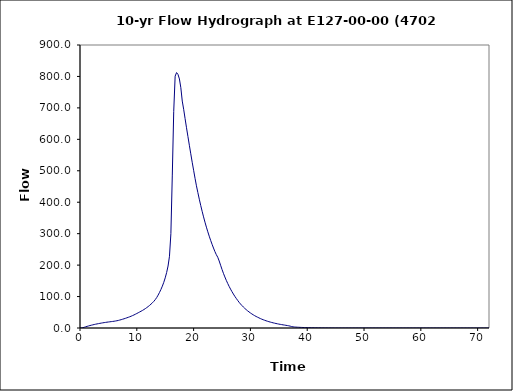
| Category | Series 0 |
|---|---|
| 0.0 | 0 |
| 0.25 | 0.2 |
| 0.5 | 1 |
| 0.75 | 2.3 |
| 1.0 | 3.8 |
| 1.25 | 5.2 |
| 1.5 | 6.5 |
| 1.75 | 7.8 |
| 2.0 | 8.9 |
| 2.25 | 10 |
| 2.5 | 11.1 |
| 2.75 | 12.1 |
| 3.0 | 13 |
| 3.25 | 13.9 |
| 3.5 | 14.8 |
| 3.75 | 15.6 |
| 4.0 | 16.4 |
| 4.25 | 17.1 |
| 4.5 | 17.8 |
| 4.75 | 18.5 |
| 5.0 | 19.1 |
| 5.25 | 19.7 |
| 5.5 | 20.3 |
| 5.75 | 20.9 |
| 6.0 | 21.5 |
| 6.25 | 22.3 |
| 6.5 | 23.1 |
| 6.75 | 24.1 |
| 7.0 | 25.3 |
| 7.25 | 26.5 |
| 7.5 | 27.9 |
| 7.75 | 29.3 |
| 8.0 | 30.8 |
| 8.25 | 32.4 |
| 8.5 | 34 |
| 8.75 | 35.7 |
| 9.0 | 37.5 |
| 9.25 | 39.5 |
| 9.5 | 41.5 |
| 9.75 | 43.8 |
| 10.0 | 46.1 |
| 10.25 | 48.5 |
| 10.5 | 50.9 |
| 10.75 | 53.4 |
| 11.0 | 55.9 |
| 11.25 | 58.7 |
| 11.5 | 61.6 |
| 11.75 | 64.8 |
| 12.0 | 68.2 |
| 12.25 | 71.9 |
| 12.5 | 75.9 |
| 12.75 | 80.2 |
| 13.0 | 84.8 |
| 13.25 | 90.3 |
| 13.5 | 96.8 |
| 13.75 | 104.5 |
| 14.0 | 113.2 |
| 14.25 | 122.7 |
| 14.5 | 133.2 |
| 14.75 | 145.3 |
| 15.0 | 159.5 |
| 15.25 | 176.4 |
| 15.5 | 197.1 |
| 15.75 | 228.2 |
| 16.0 | 299.9 |
| 16.25 | 486.3 |
| 16.5 | 689 |
| 16.75 | 800.9 |
| 17.0 | 812.3 |
| 17.25 | 806.4 |
| 17.5 | 792 |
| 17.75 | 764.1 |
| 18.0 | 721.7 |
| 18.25 | 695.6 |
| 18.5 | 666 |
| 18.75 | 636.8 |
| 19.0 | 609 |
| 19.25 | 581.2 |
| 19.5 | 554 |
| 19.75 | 527.2 |
| 20.0 | 501.6 |
| 20.25 | 476.1 |
| 20.5 | 452.2 |
| 20.75 | 430.6 |
| 21.0 | 409.7 |
| 21.25 | 389.9 |
| 21.5 | 371.2 |
| 21.75 | 353.4 |
| 22.0 | 336.6 |
| 22.25 | 320.7 |
| 22.5 | 305.9 |
| 22.75 | 292 |
| 23.0 | 278.7 |
| 23.25 | 266.2 |
| 23.5 | 254.3 |
| 23.75 | 243 |
| 24.0 | 233.1 |
| 24.25 | 224.9 |
| 24.5 | 213.1 |
| 24.75 | 199.6 |
| 25.0 | 186.3 |
| 25.25 | 173.9 |
| 25.5 | 162.4 |
| 25.75 | 151.7 |
| 26.0 | 141.7 |
| 26.25 | 132.4 |
| 26.5 | 123.7 |
| 26.75 | 115.6 |
| 27.0 | 108 |
| 27.25 | 100.9 |
| 27.5 | 94.3 |
| 27.75 | 88 |
| 28.0 | 81.9 |
| 28.25 | 76.5 |
| 28.5 | 71.5 |
| 28.75 | 66.9 |
| 29.0 | 62.5 |
| 29.25 | 58.5 |
| 29.5 | 54.7 |
| 29.75 | 51.2 |
| 30.0 | 47.9 |
| 30.25 | 44.8 |
| 30.5 | 41.9 |
| 30.75 | 39.2 |
| 31.0 | 36.7 |
| 31.25 | 34.4 |
| 31.5 | 32.2 |
| 31.75 | 30.1 |
| 32.0 | 28.1 |
| 32.25 | 26.3 |
| 32.5 | 24.6 |
| 32.75 | 23 |
| 33.0 | 21.5 |
| 33.25 | 20.1 |
| 33.5 | 18.8 |
| 33.75 | 17.6 |
| 34.0 | 16.4 |
| 34.25 | 15.4 |
| 34.5 | 14.3 |
| 34.75 | 13.4 |
| 35.0 | 12.4 |
| 35.25 | 11.6 |
| 35.5 | 10.8 |
| 35.75 | 10 |
| 36.0 | 9.3 |
| 36.25 | 8.5 |
| 36.5 | 7.8 |
| 36.75 | 7 |
| 37.0 | 5.9 |
| 37.25 | 4.6 |
| 37.5 | 3.6 |
| 37.75 | 3.2 |
| 38.0 | 2.8 |
| 38.25 | 2.5 |
| 38.5 | 2.3 |
| 38.75 | 2 |
| 39.0 | 1.8 |
| 39.25 | 1.6 |
| 39.5 | 1.5 |
| 39.75 | 1.3 |
| 40.0 | 1.2 |
| 40.25 | 1.1 |
| 40.5 | 0.9 |
| 40.75 | 0.8 |
| 41.0 | 0.8 |
| 41.25 | 0.7 |
| 41.5 | 0.6 |
| 41.75 | 0.5 |
| 42.0 | 0.5 |
| 42.25 | 0.4 |
| 42.5 | 0.3 |
| 42.75 | 0.3 |
| 43.0 | 0.3 |
| 43.25 | 0.2 |
| 43.5 | 0.2 |
| 43.75 | 0.1 |
| 44.0 | 0.1 |
| 44.25 | 0.1 |
| 44.5 | 0.1 |
| 44.75 | 0 |
| 45.0 | 0 |
| 45.25 | 0 |
| 45.5 | 0 |
| 45.75 | 0 |
| 46.0 | 0 |
| 46.25 | 0 |
| 46.5 | 0 |
| 46.75 | 0 |
| 47.0 | 0 |
| 47.25 | 0 |
| 47.5 | 0 |
| 47.75 | 0 |
| 48.0 | 0 |
| 48.25 | 0 |
| 48.5 | 0 |
| 48.75 | 0 |
| 49.0 | 0 |
| 49.25 | 0 |
| 49.5 | 0 |
| 49.75 | 0 |
| 50.0 | 0 |
| 50.25 | 0 |
| 50.5 | 0 |
| 50.75 | 0 |
| 51.0 | 0 |
| 51.25 | 0 |
| 51.5 | 0 |
| 51.75 | 0 |
| 52.0 | 0 |
| 52.25 | 0 |
| 52.5 | 0 |
| 52.75 | 0 |
| 53.0 | 0 |
| 53.25 | 0 |
| 53.5 | 0 |
| 53.75 | 0 |
| 54.0 | 0 |
| 54.25 | 0 |
| 54.5 | 0 |
| 54.75 | 0 |
| 55.0 | 0 |
| 55.25 | 0 |
| 55.5 | 0 |
| 55.75 | 0 |
| 56.0 | 0 |
| 56.25 | 0 |
| 56.5 | 0 |
| 56.75 | 0 |
| 57.0 | 0 |
| 57.25 | 0 |
| 57.5 | 0 |
| 57.75 | 0 |
| 58.0 | 0 |
| 58.25 | 0 |
| 58.5 | 0 |
| 58.75 | 0 |
| 59.0 | 0 |
| 59.25 | 0 |
| 59.5 | 0 |
| 59.75 | 0 |
| 60.0 | 0 |
| 60.25 | 0 |
| 60.5 | 0 |
| 60.75 | 0 |
| 61.0 | 0 |
| 61.25 | 0 |
| 61.5 | 0 |
| 61.75 | 0 |
| 62.0 | 0 |
| 62.25 | 0 |
| 62.5 | 0 |
| 62.75 | 0 |
| 63.0 | 0 |
| 63.25 | 0 |
| 63.5 | 0 |
| 63.75 | 0 |
| 64.0 | 0 |
| 64.25 | 0 |
| 64.5 | 0 |
| 64.75 | 0 |
| 65.0 | 0 |
| 65.25 | 0 |
| 65.5 | 0 |
| 65.75 | 0 |
| 66.0 | 0 |
| 66.25 | 0 |
| 66.5 | 0 |
| 66.75 | 0 |
| 67.0 | 0 |
| 67.25 | 0 |
| 67.5 | 0 |
| 67.75 | 0 |
| 68.0 | 0 |
| 68.25 | 0 |
| 68.5 | 0 |
| 68.75 | 0 |
| 69.0 | 0 |
| 69.25 | 0 |
| 69.5 | 0 |
| 69.75 | 0 |
| 70.0 | 0 |
| 70.25 | 0 |
| 70.5 | 0 |
| 70.75 | 0 |
| 71.0 | 0 |
| 71.25 | 0 |
| 71.5 | 0 |
| 71.75 | 0 |
| 72.0 | 0 |
| 72.25 | 0 |
| 72.5 | 0 |
| 72.75 | 0 |
| 73.0 | 0 |
| 73.25 | 0 |
| 73.5 | 0 |
| 73.75 | 0 |
| 74.0 | 0 |
| 74.25 | 0 |
| 74.5 | 0 |
| 74.75 | 0 |
| 75.0 | 0 |
| 75.25 | 0 |
| 75.5 | 0 |
| 75.75 | 0 |
| 76.0 | 0 |
| 76.25 | 0 |
| 76.5 | 0 |
| 76.75 | 0 |
| 77.0 | 0 |
| 77.25 | 0 |
| 77.5 | 0 |
| 77.75 | 0 |
| 78.0 | 0 |
| 78.25 | 0 |
| 78.5 | 0 |
| 78.75 | 0 |
| 79.0 | 0 |
| 79.25 | 0 |
| 79.5 | 0 |
| 79.75 | 0 |
| 80.0 | 0 |
| 80.25 | 0 |
| 80.5 | 0 |
| 80.75 | 0 |
| 81.0 | 0 |
| 81.25 | 0 |
| 81.5 | 0 |
| 81.75 | 0 |
| 82.0 | 0 |
| 82.25 | 0 |
| 82.5 | 0 |
| 82.75 | 0 |
| 83.0 | 0 |
| 83.25 | 0 |
| 83.5 | 0 |
| 83.75 | 0 |
| 84.0 | 0 |
| 84.25 | 0 |
| 84.5 | 0 |
| 84.75 | 0 |
| 85.0 | 0 |
| 85.25 | 0 |
| 85.5 | 0 |
| 85.75 | 0 |
| 86.0 | 0 |
| 86.25 | 0 |
| 86.5 | 0 |
| 86.75 | 0 |
| 87.0 | 0 |
| 87.25 | 0 |
| 87.5 | 0 |
| 87.75 | 0 |
| 88.0 | 0 |
| 88.25 | 0 |
| 88.5 | 0 |
| 88.75 | 0 |
| 89.0 | 0 |
| 89.25 | 0 |
| 89.5 | 0 |
| 89.75 | 0 |
| 90.0 | 0 |
| 90.25 | 0 |
| 90.5 | 0 |
| 90.75 | 0 |
| 91.0 | 0 |
| 91.25 | 0 |
| 91.5 | 0 |
| 91.75 | 0 |
| 92.0 | 0 |
| 92.25 | 0 |
| 92.5 | 0 |
| 92.75 | 0 |
| 93.0 | 0 |
| 93.25 | 0 |
| 93.5 | 0 |
| 93.75 | 0 |
| 94.0 | 0 |
| 94.25 | 0 |
| 94.5 | 0 |
| 94.75 | 0 |
| 95.0 | 0 |
| 95.25 | 0 |
| 95.5 | 0 |
| 95.75 | 0 |
| 96.0 | 0 |
| 96.25 | 0 |
| 96.5 | 0 |
| 96.75 | 0 |
| 97.0 | 0 |
| 97.25 | 0 |
| 97.5 | 0 |
| 97.75 | 0 |
| 98.0 | 0 |
| 98.25 | 0 |
| 98.5 | 0 |
| 98.75 | 0 |
| 99.0 | 0 |
| 99.25 | 0 |
| 99.5 | 0 |
| 99.75 | 0 |
| 100.0 | 0 |
| 100.25 | 0 |
| 100.5 | 0 |
| 100.75 | 0 |
| 101.0 | 0 |
| 101.25 | 0 |
| 101.5 | 0 |
| 101.75 | 0 |
| 102.0 | 0 |
| 102.25 | 0 |
| 102.5 | 0 |
| 102.75 | 0 |
| 103.0 | 0 |
| 103.25 | 0 |
| 103.5 | 0 |
| 103.75 | 0 |
| 104.0 | 0 |
| 104.25 | 0 |
| 104.5 | 0 |
| 104.75 | 0 |
| 105.0 | 0 |
| 105.25 | 0 |
| 105.5 | 0 |
| 105.75 | 0 |
| 106.0 | 0 |
| 106.25 | 0 |
| 106.5 | 0 |
| 106.75 | 0 |
| 107.0 | 0 |
| 107.25 | 0 |
| 107.5 | 0 |
| 107.75 | 0 |
| 108.0 | 0 |
| 108.25 | 0 |
| 108.5 | 0 |
| 108.75 | 0 |
| 109.0 | 0 |
| 109.25 | 0 |
| 109.5 | 0 |
| 109.75 | 0 |
| 110.0 | 0 |
| 110.25 | 0 |
| 110.5 | 0 |
| 110.75 | 0 |
| 111.0 | 0 |
| 111.25 | 0 |
| 111.5 | 0 |
| 111.75 | 0 |
| 112.0 | 0 |
| 112.25 | 0 |
| 112.5 | 0 |
| 112.75 | 0 |
| 113.0 | 0 |
| 113.25 | 0 |
| 113.5 | 0 |
| 113.75 | 0 |
| 114.0 | 0 |
| 114.25 | 0 |
| 114.5 | 0 |
| 114.75 | 0 |
| 115.0 | 0 |
| 115.25 | 0 |
| 115.5 | 0 |
| 115.75 | 0 |
| 116.0 | 0 |
| 116.25 | 0 |
| 116.5 | 0 |
| 116.75 | 0 |
| 117.0 | 0 |
| 117.25 | 0 |
| 117.5 | 0 |
| 117.75 | 0 |
| 118.0 | 0 |
| 118.25 | 0 |
| 118.5 | 0 |
| 118.75 | 0 |
| 119.0 | 0 |
| 119.25 | 0 |
| 119.5 | 0 |
| 119.75 | 0 |
| 120.0 | 0 |
| 120.25 | 0 |
| 120.5 | 0 |
| 120.75 | 0 |
| 121.0 | 0 |
| 121.25 | 0 |
| 121.5 | 0 |
| 121.75 | 0 |
| 122.0 | 0 |
| 122.25 | 0 |
| 122.5 | 0 |
| 122.75 | 0 |
| 123.0 | 0 |
| 123.25 | 0 |
| 123.5 | 0 |
| 123.75 | 0 |
| 124.0 | 0 |
| 124.25 | 0 |
| 124.5 | 0 |
| 124.75 | 0 |
| 125.0 | 0 |
| 125.25 | 0 |
| 125.5 | 0 |
| 125.75 | 0 |
| 126.0 | 0 |
| 126.25 | 0 |
| 126.5 | 0 |
| 126.75 | 0 |
| 127.0 | 0 |
| 127.25 | 0 |
| 127.5 | 0 |
| 127.75 | 0 |
| 128.0 | 0 |
| 128.25 | 0 |
| 128.5 | 0 |
| 128.75 | 0 |
| 129.0 | 0 |
| 129.25 | 0 |
| 129.5 | 0 |
| 129.75 | 0 |
| 130.0 | 0 |
| 130.25 | 0 |
| 130.5 | 0 |
| 130.75 | 0 |
| 131.0 | 0 |
| 131.25 | 0 |
| 131.5 | 0 |
| 131.75 | 0 |
| 132.0 | 0 |
| 132.25 | 0 |
| 132.5 | 0 |
| 132.75 | 0 |
| 133.0 | 0 |
| 133.25 | 0 |
| 133.5 | 0 |
| 133.75 | 0 |
| 134.0 | 0 |
| 134.25 | 0 |
| 134.5 | 0 |
| 134.75 | 0 |
| 135.0 | 0 |
| 135.25 | 0 |
| 135.5 | 0 |
| 135.75 | 0 |
| 136.0 | 0 |
| 136.25 | 0 |
| 136.5 | 0 |
| 136.75 | 0 |
| 137.0 | 0 |
| 137.25 | 0 |
| 137.5 | 0 |
| 137.75 | 0 |
| 138.0 | 0 |
| 138.25 | 0 |
| 138.5 | 0 |
| 138.75 | 0 |
| 139.0 | 0 |
| 139.25 | 0 |
| 139.5 | 0 |
| 139.75 | 0 |
| 140.0 | 0 |
| 140.25 | 0 |
| 140.5 | 0 |
| 140.75 | 0 |
| 141.0 | 0 |
| 141.25 | 0 |
| 141.5 | 0 |
| 141.75 | 0 |
| 142.0 | 0 |
| 142.25 | 0 |
| 142.5 | 0 |
| 142.75 | 0 |
| 143.0 | 0 |
| 143.25 | 0 |
| 143.5 | 0 |
| 143.75 | 0 |
| 144.0 | 0 |
| 144.25 | 0 |
| 144.5 | 0 |
| 144.75 | 0 |
| 145.0 | 0 |
| 145.25 | 0 |
| 145.5 | 0 |
| 145.75 | 0 |
| 146.0 | 0 |
| 146.25 | 0 |
| 146.5 | 0 |
| 146.75 | 0 |
| 147.0 | 0 |
| 147.25 | 0 |
| 147.5 | 0 |
| 147.75 | 0 |
| 148.0 | 0 |
| 148.25 | 0 |
| 148.5 | 0 |
| 148.75 | 0 |
| 149.0 | 0 |
| 149.25 | 0 |
| 149.5 | 0 |
| 149.75 | 0 |
| 150.0 | 0 |
| 150.25 | 0 |
| 150.5 | 0 |
| 150.75 | 0 |
| 151.0 | 0 |
| 151.25 | 0 |
| 151.5 | 0 |
| 151.75 | 0 |
| 152.0 | 0 |
| 152.25 | 0 |
| 152.5 | 0 |
| 152.75 | 0 |
| 153.0 | 0 |
| 153.25 | 0 |
| 153.5 | 0 |
| 153.75 | 0 |
| 154.0 | 0 |
| 154.25 | 0 |
| 154.5 | 0 |
| 154.75 | 0 |
| 155.0 | 0 |
| 155.25 | 0 |
| 155.5 | 0 |
| 155.75 | 0 |
| 156.0 | 0 |
| 156.25 | 0 |
| 156.5 | 0 |
| 156.75 | 0 |
| 157.0 | 0 |
| 157.25 | 0 |
| 157.5 | 0 |
| 157.75 | 0 |
| 158.0 | 0 |
| 158.25 | 0 |
| 158.5 | 0 |
| 158.75 | 0 |
| 159.0 | 0 |
| 159.25 | 0 |
| 159.5 | 0 |
| 159.75 | 0 |
| 160.0 | 0 |
| 160.25 | 0 |
| 160.5 | 0 |
| 160.75 | 0 |
| 161.0 | 0 |
| 161.25 | 0 |
| 161.5 | 0 |
| 161.75 | 0 |
| 162.0 | 0 |
| 162.25 | 0 |
| 162.5 | 0 |
| 162.75 | 0 |
| 163.0 | 0 |
| 163.25 | 0 |
| 163.5 | 0 |
| 163.75 | 0 |
| 164.0 | 0 |
| 164.25 | 0 |
| 164.5 | 0 |
| 164.75 | 0 |
| 165.0 | 0 |
| 165.25 | 0 |
| 165.5 | 0 |
| 165.75 | 0 |
| 166.0 | 0 |
| 166.25 | 0 |
| 166.5 | 0 |
| 166.75 | 0 |
| 167.0 | 0 |
| 167.25 | 0 |
| 167.5 | 0 |
| 167.75 | 0 |
| 168.0 | 0 |
| 168.25 | 0 |
| 168.5 | 0 |
| 168.75 | 0 |
| 169.0 | 0 |
| 169.25 | 0 |
| 169.5 | 0 |
| 169.75 | 0 |
| 170.0 | 0 |
| 170.25 | 0 |
| 170.5 | 0 |
| 170.75 | 0 |
| 171.0 | 0 |
| 171.25 | 0 |
| 171.5 | 0 |
| 171.75 | 0 |
| 172.0 | 0 |
| 172.25 | 0 |
| 172.5 | 0 |
| 172.75 | 0 |
| 173.0 | 0 |
| 173.25 | 0 |
| 173.5 | 0 |
| 173.75 | 0 |
| 174.0 | 0 |
| 174.25 | 0 |
| 174.5 | 0 |
| 174.75 | 0 |
| 175.0 | 0 |
| 175.25 | 0 |
| 175.5 | 0 |
| 175.75 | 0 |
| 176.0 | 0 |
| 176.25 | 0 |
| 176.5 | 0 |
| 176.75 | 0 |
| 177.0 | 0 |
| 177.25 | 0 |
| 177.5 | 0 |
| 177.75 | 0 |
| 178.0 | 0 |
| 178.25 | 0 |
| 178.5 | 0 |
| 178.75 | 0 |
| 179.0 | 0 |
| 179.25 | 0 |
| 179.5 | 0 |
| 179.75 | 0 |
| 180.0 | 0 |
| 180.25 | 0 |
| 180.5 | 0 |
| 180.75 | 0 |
| 181.0 | 0 |
| 181.25 | 0 |
| 181.5 | 0 |
| 181.75 | 0 |
| 182.0 | 0 |
| 182.25 | 0 |
| 182.5 | 0 |
| 182.75 | 0 |
| 183.0 | 0 |
| 183.25 | 0 |
| 183.5 | 0 |
| 183.75 | 0 |
| 184.0 | 0 |
| 184.25 | 0 |
| 184.5 | 0 |
| 184.75 | 0 |
| 185.0 | 0 |
| 185.25 | 0 |
| 185.5 | 0 |
| 185.75 | 0 |
| 186.0 | 0 |
| 186.25 | 0 |
| 186.5 | 0 |
| 186.75 | 0 |
| 187.0 | 0 |
| 187.25 | 0 |
| 187.5 | 0 |
| 187.75 | 0 |
| 188.0 | 0 |
| 188.25 | 0 |
| 188.5 | 0 |
| 188.75 | 0 |
| 189.0 | 0 |
| 189.25 | 0 |
| 189.5 | 0 |
| 189.75 | 0 |
| 190.0 | 0 |
| 190.25 | 0 |
| 190.5 | 0 |
| 190.75 | 0 |
| 191.0 | 0 |
| 191.25 | 0 |
| 191.5 | 0 |
| 191.75 | 0 |